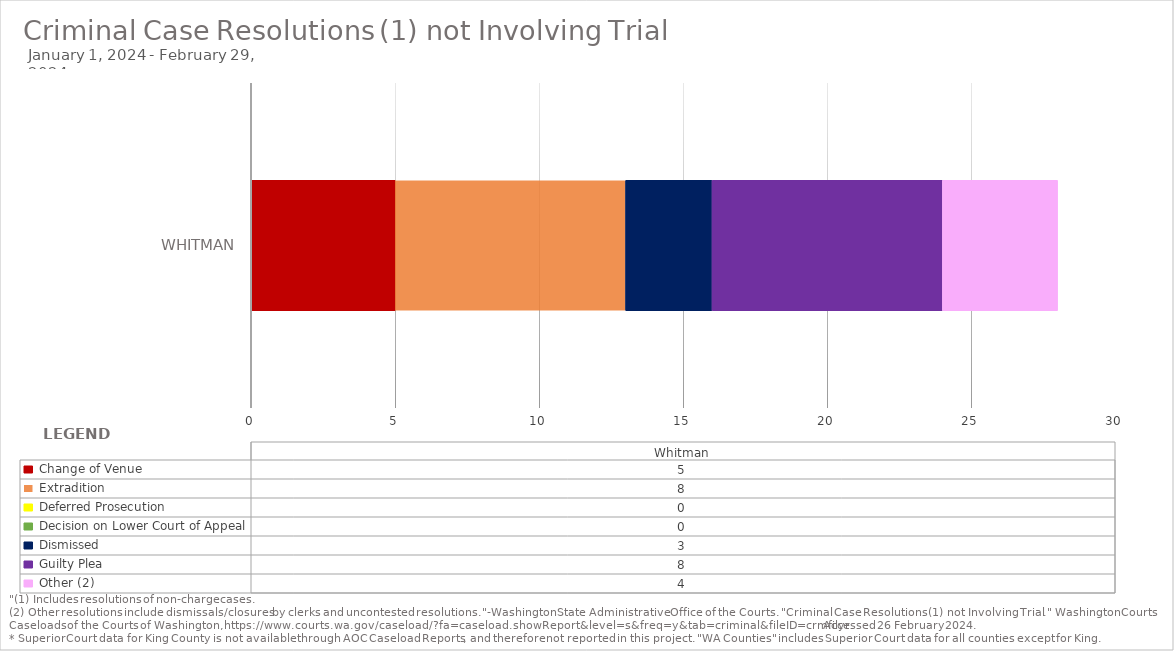
| Category |  Change of Venue  |  Extradition  |  Deferred Prosecution  |  Decision on Lower Court of Appeal  |  Dismissed  |  Guilty Plea  |  Other (2)  |
|---|---|---|---|---|---|---|---|
| Whitman | 5 | 8 | 0 | 0 | 3 | 8 | 4 |